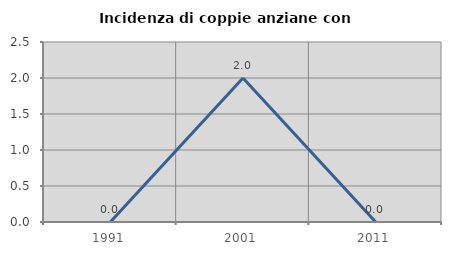
| Category | Incidenza di coppie anziane con figli |
|---|---|
| 1991.0 | 0 |
| 2001.0 | 2 |
| 2011.0 | 0 |